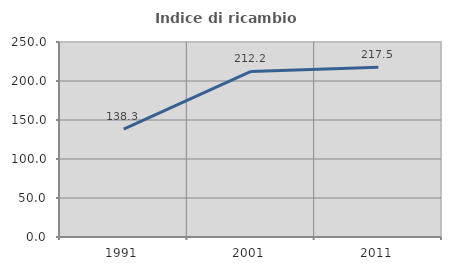
| Category | Indice di ricambio occupazionale  |
|---|---|
| 1991.0 | 138.251 |
| 2001.0 | 212.195 |
| 2011.0 | 217.483 |